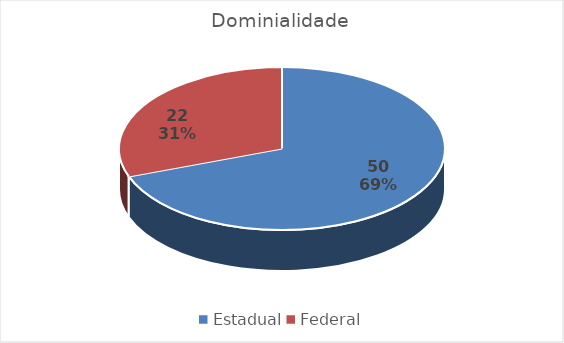
| Category | Dominialidade |
|---|---|
| Estadual | 50 |
| Federal | 22 |